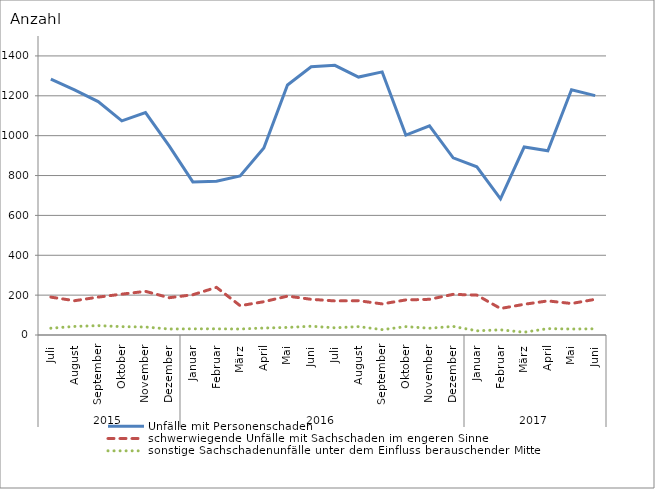
| Category | Unfälle mit Personenschaden | schwerwiegende Unfälle mit Sachschaden im engeren Sinne | sonstige Sachschadenunfälle unter dem Einfluss berauschender Mittel |
|---|---|---|---|
| 0 | 1284 | 190 | 34 |
| 1 | 1230 | 172 | 43 |
| 2 | 1171 | 190 | 47 |
| 3 | 1074 | 205 | 42 |
| 4 | 1116 | 219 | 40 |
| 5 | 949 | 187 | 30 |
| 6 | 768 | 202 | 31 |
| 7 | 771 | 239 | 31 |
| 8 | 798 | 147 | 30 |
| 9 | 938 | 167 | 35 |
| 10 | 1254 | 195 | 38 |
| 11 | 1346 | 179 | 44 |
| 12 | 1353 | 171 | 36 |
| 13 | 1294 | 172 | 42 |
| 14 | 1320 | 156 | 27 |
| 15 | 1003 | 176 | 42 |
| 16 | 1049 | 179 | 34 |
| 17 | 889 | 204 | 43 |
| 18 | 844 | 200 | 21 |
| 19 | 683 | 133 | 26 |
| 20 | 943 | 154 | 14 |
| 21 | 924 | 171 | 32 |
| 22 | 1230 | 158 | 30 |
| 23 | 1201 | 179 | 31 |